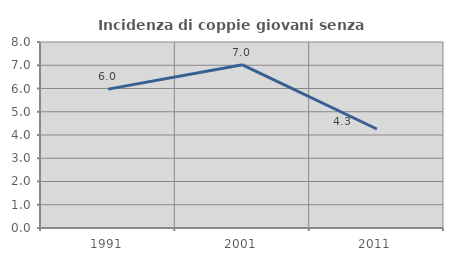
| Category | Incidenza di coppie giovani senza figli |
|---|---|
| 1991.0 | 5.974 |
| 2001.0 | 7.018 |
| 2011.0 | 4.259 |